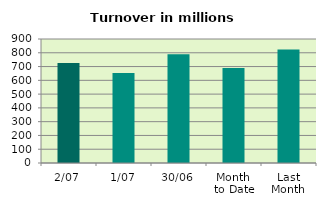
| Category | Series 0 |
|---|---|
| 2/07 | 725.214 |
| 1/07 | 652.35 |
| 30/06 | 789.864 |
| Month 
to Date | 688.782 |
| Last
Month | 824.124 |